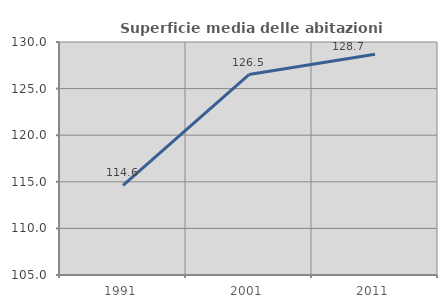
| Category | Superficie media delle abitazioni occupate |
|---|---|
| 1991.0 | 114.618 |
| 2001.0 | 126.508 |
| 2011.0 | 128.689 |